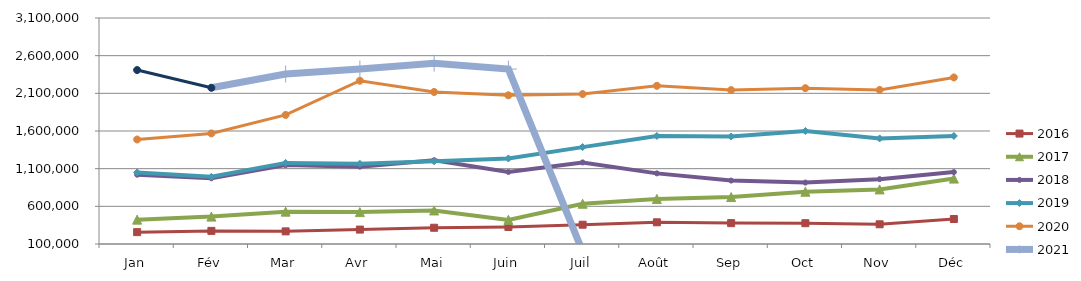
| Category | 2015 | 2016 | 2017 | 2018 | 2019 | 2020 | 2021 |
|---|---|---|---|---|---|---|---|
| Jan |  | 257238.227 | 423360.679 | 1019658.015 | 1050220.805 | 1487095.506 | 2408854.792 |
| Fév |  | 274182.928 | 463512.001 | 972274.256 | 992184.961 | 1568141.915 | 2173768.196 |
| Mar |  | 267739.55 | 529345.368 | 1147166.528 | 1176757.88 | 1813146.21 | 2357168.574 |
| Avr |  | 291238.37 | 523228.337 | 1126714.531 | 1164825.987 | 2267448.511 | 2422161.719 |
| Mai |  | 315573.949 | 545414.731 | 1212070.878 | 1197851.486 | 2117791.111 | 2500803.422 |
| Juin |  | 326203.362 | 420430.116 | 1056092.947 | 1235809.908 | 2073858.17 | 2421915.839 |
| Juil |  | 356111.54 | 634345.533 | 1183060.966 | 1386180.582 | 2090325.728 | 0 |
| Août |  | 388007.58 | 698691.374 | 1037606.311 | 1534426.4 | 2199836.197 | 0 |
| Sep |  | 377114.56 | 722782.357 | 941820.554 | 1527323.009 | 2142727.977 | 0 |
| Oct |  | 376009.188 | 793837.955 | 915772.772 | 1599889.902 | 2168338.194 | 0 |
| Nov |  | 361587.784 | 824574.744 | 960817.552 | 1501599.407 | 2145083.497 | 0 |
| Déc |  | 431907.412 | 968412.649 | 1054685.303 | 1534756.751 | 2310730.947 | 0 |